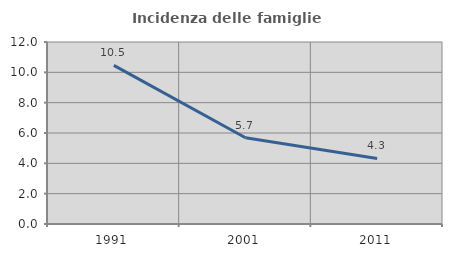
| Category | Incidenza delle famiglie numerose |
|---|---|
| 1991.0 | 10.463 |
| 2001.0 | 5.686 |
| 2011.0 | 4.323 |